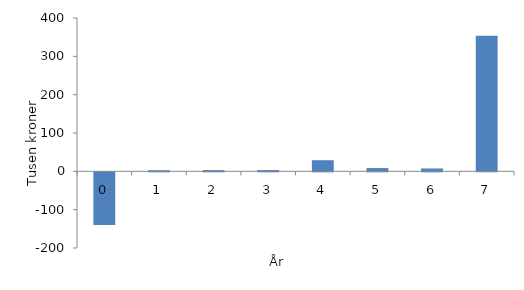
| Category | Series 0 |
|---|---|
| 0.0 | -137.5 |
| 1.0 | 3 |
| 2.0 | 3.25 |
| 3.0 | 3.4 |
| 4.0 | 29 |
| 5.0 | 8.5 |
| 6.0 | 7.5 |
| 7.0 | 354 |